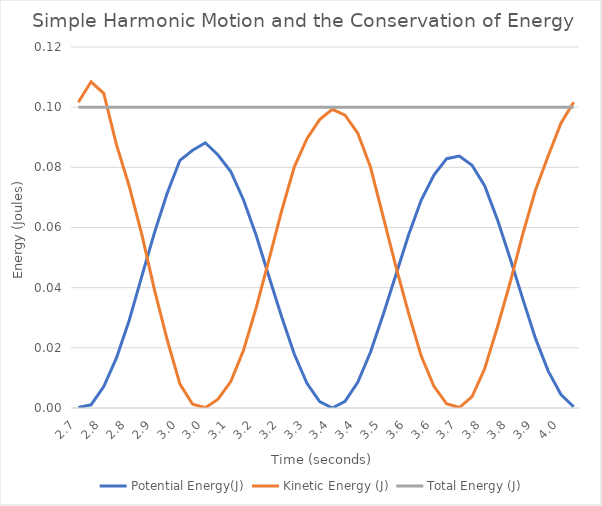
| Category | Potential Energy(J) | Kinetic Energy (J) | Total Energy (J) |
|---|---|---|---|
| 2.6973 | 0 | 0.102 | 0.1 |
| 2.7306 | 0.001 | 0.108 | 0.1 |
| 2.7639 | 0.007 | 0.105 | 0.1 |
| 2.7972 | 0.017 | 0.088 | 0.1 |
| 2.8305 | 0.029 | 0.074 | 0.1 |
| 2.8638 | 0.044 | 0.058 | 0.1 |
| 2.8971 | 0.058 | 0.039 | 0.1 |
| 2.9304 | 0.071 | 0.023 | 0.1 |
| 2.9637 | 0.082 | 0.008 | 0.1 |
| 2.997 | 0.086 | 0.001 | 0.1 |
| 3.0303 | 0.088 | 0 | 0.1 |
| 3.0636 | 0.084 | 0.003 | 0.1 |
| 3.0969 | 0.079 | 0.009 | 0.1 |
| 3.1302 | 0.069 | 0.019 | 0.1 |
| 3.1635 | 0.057 | 0.033 | 0.1 |
| 3.1968 | 0.044 | 0.049 | 0.1 |
| 3.2301 | 0.03 | 0.065 | 0.1 |
| 3.2634 | 0.018 | 0.08 | 0.1 |
| 3.2967 | 0.008 | 0.089 | 0.1 |
| 3.33 | 0.002 | 0.096 | 0.1 |
| 3.3633 | 0 | 0.099 | 0.1 |
| 3.3966 | 0.002 | 0.097 | 0.1 |
| 3.4299 | 0.009 | 0.091 | 0.1 |
| 3.4632 | 0.019 | 0.08 | 0.1 |
| 3.4965 | 0.031 | 0.064 | 0.1 |
| 3.5298 | 0.044 | 0.047 | 0.1 |
| 3.5631 | 0.058 | 0.032 | 0.1 |
| 3.5964 | 0.069 | 0.017 | 0.1 |
| 3.6297 | 0.077 | 0.007 | 0.1 |
| 3.663 | 0.083 | 0.001 | 0.1 |
| 3.6963 | 0.084 | 0 | 0.1 |
| 3.7296 | 0.081 | 0.004 | 0.1 |
| 3.7629 | 0.074 | 0.013 | 0.1 |
| 3.7962 | 0.063 | 0.027 | 0.1 |
| 3.8295 | 0.05 | 0.042 | 0.1 |
| 3.8628 | 0.036 | 0.058 | 0.1 |
| 3.8961 | 0.023 | 0.073 | 0.1 |
| 3.9294 | 0.012 | 0.084 | 0.1 |
| 3.9627 | 0.004 | 0.095 | 0.1 |
| 3.996 | 0 | 0.102 | 0.1 |